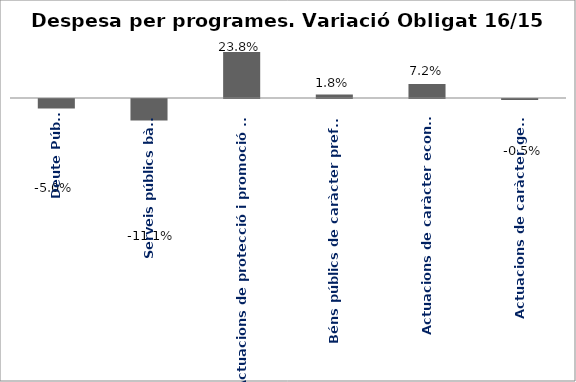
| Category | Series 0 |
|---|---|
| Deute Públic | -0.05 |
| Serveis públics bàsics | -0.111 |
| Actuacions de protecció i promoció social | 0.238 |
| Béns públics de caràcter preferent | 0.018 |
| Actuacions de caràcter econòmic | 0.072 |
| Actuacions de caràcter general | -0.005 |